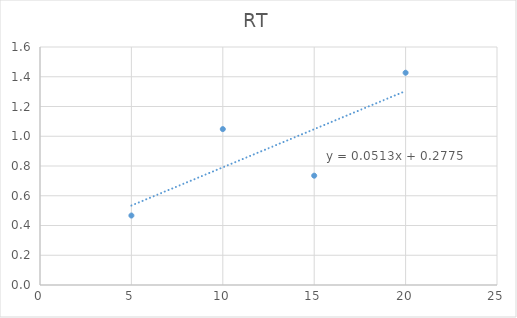
| Category | RT |
|---|---|
| 5.0 | 0.467 |
| 10.0 | 1.048 |
| 15.0 | 0.735 |
| 20.0 | 1.427 |